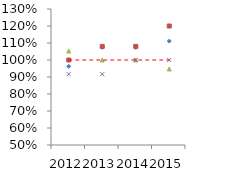
| Category | ACC Ltd Fixed Cost | Ambuja Cement Fixed Cost | JK Lakshmi Cement Fixed Cost | Ultratech Cement Fixed Cost | Baseline |
|---|---|---|---|---|---|
| 2012.0 | 0.963 | 1 | 1.053 | 0.917 | 1 |
| 2013.0 | 1.074 | 1.08 | 1 | 0.917 | 1 |
| 2014.0 | 1.074 | 1.08 | 1 | 1 | 1 |
| 2015.0 | 1.111 | 1.2 | 0.947 | 1 | 1 |